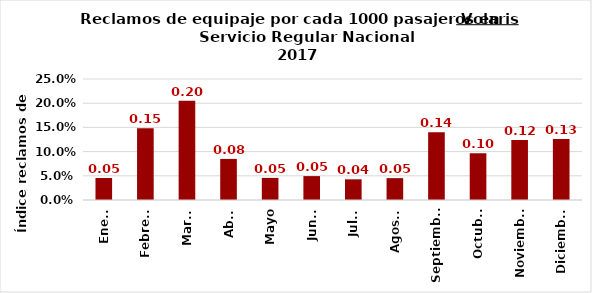
| Category | Reclamos por cada 1000 pasajeros |
|---|---|
| Enero | 0.045 |
| Febrero | 0.148 |
| Marzo | 0.205 |
| Abril | 0.085 |
| Mayo | 0.046 |
| Junio | 0.049 |
| Julio | 0.043 |
| Agosto | 0.045 |
| Septiembre | 0.14 |
| Octubre | 0.097 |
| Noviembre | 0.124 |
| Diciembre | 0.126 |